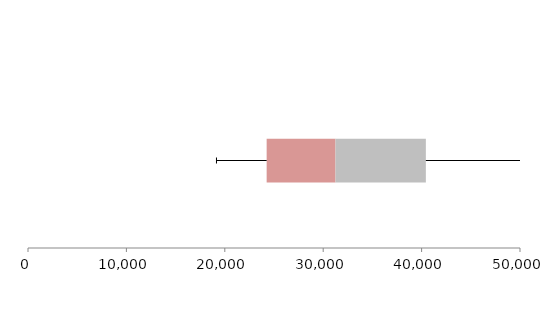
| Category | Series 1 | Series 2 | Series 3 |
|---|---|---|---|
| 0 | 24253.524 | 6997.069 | 9181.826 |